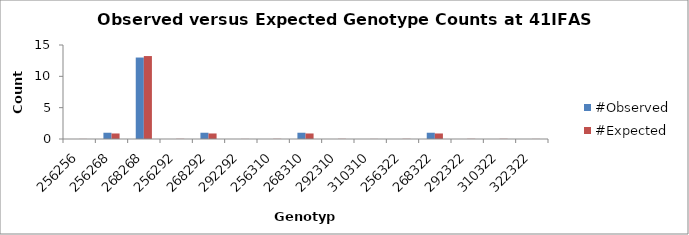
| Category | #Observed | #Expected |
|---|---|---|
| 256256.0 | 0 | 0.015 |
| 256268.0 | 1 | 0.882 |
| 268268.0 | 13 | 13.235 |
| 256292.0 | 0 | 0.029 |
| 268292.0 | 1 | 0.882 |
| 292292.0 | 0 | 0.015 |
| 256310.0 | 0 | 0.029 |
| 268310.0 | 1 | 0.882 |
| 292310.0 | 0 | 0.029 |
| 310310.0 | 0 | 0.015 |
| 256322.0 | 0 | 0.029 |
| 268322.0 | 1 | 0.882 |
| 292322.0 | 0 | 0.029 |
| 310322.0 | 0 | 0.029 |
| 322322.0 | 0 | 0.015 |